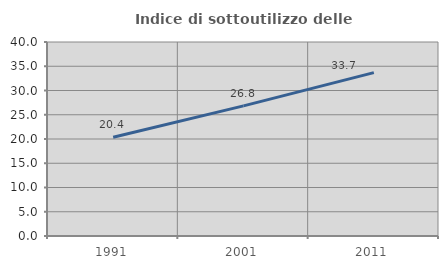
| Category | Indice di sottoutilizzo delle abitazioni  |
|---|---|
| 1991.0 | 20.374 |
| 2001.0 | 26.827 |
| 2011.0 | 33.691 |